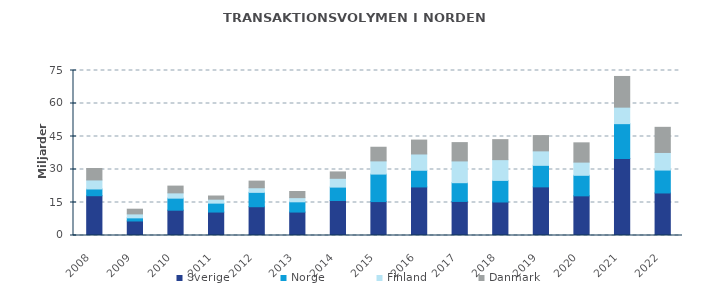
| Category | Sverige | Norge | Finland | Danmark |
|---|---|---|---|---|
| 2008.0 | 18.086 | 3.064 | 4.1 | 5.218 |
| 2009.0 | 6.597 | 1.423 | 1.8 | 2.141 |
| 2010.0 | 11.505 | 5.471 | 2.4 | 3.077 |
| 2011.0 | 10.657 | 4.049 | 1.8 | 1.446 |
| 2012.0 | 13.08 | 6.529 | 2.1 | 3.01 |
| 2013.0 | 10.654 | 4.661 | 1.9 | 2.784 |
| 2014.0 | 15.914 | 6.084 | 4 | 2.903 |
| 2015.0 | 15.417 | 12.5 | 6 | 6.2 |
| 2016.0 | 22.076 | 7.574 | 7.406 | 6.317 |
| 2017.0 | 15.489 | 8.511 | 9.9 | 8.325 |
| 2018.0 | 15.231 | 9.812 | 9.435 | 9.094 |
| 2019.0 | 22.101 | 9.791 | 6.577 | 6.942 |
| 2020.0 | 18.027 | 9.334 | 5.998 | 8.76 |
| 2021.0 | 34.993 | 15.847 | 7.497 | 13.953 |
| 2022.0 | 19.332 | 10.412 | 8 | 11.425 |